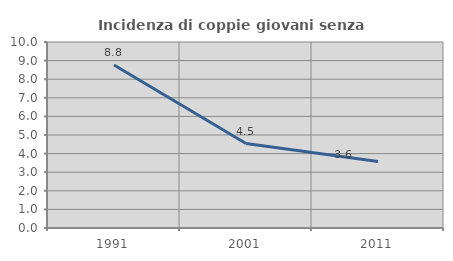
| Category | Incidenza di coppie giovani senza figli |
|---|---|
| 1991.0 | 8.765 |
| 2001.0 | 4.541 |
| 2011.0 | 3.575 |